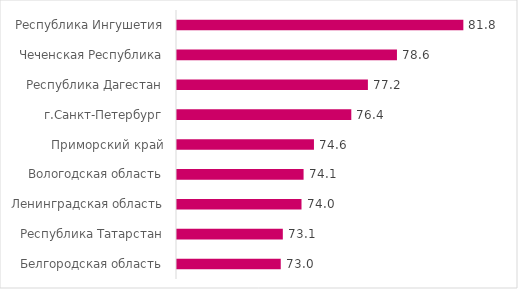
| Category | Series 0 |
|---|---|
| Республика Ингушетия | 81.8 |
| Чеченская Республика | 78.6 |
| Республика Дагестан | 77.2 |
| г.Санкт-Петербург | 76.4 |
| Приморский край | 74.6 |
| Вологодская область | 74.1 |
| Ленинградская область | 74 |
| Республика Татарстан | 73.1 |
| Белгородская область | 73 |